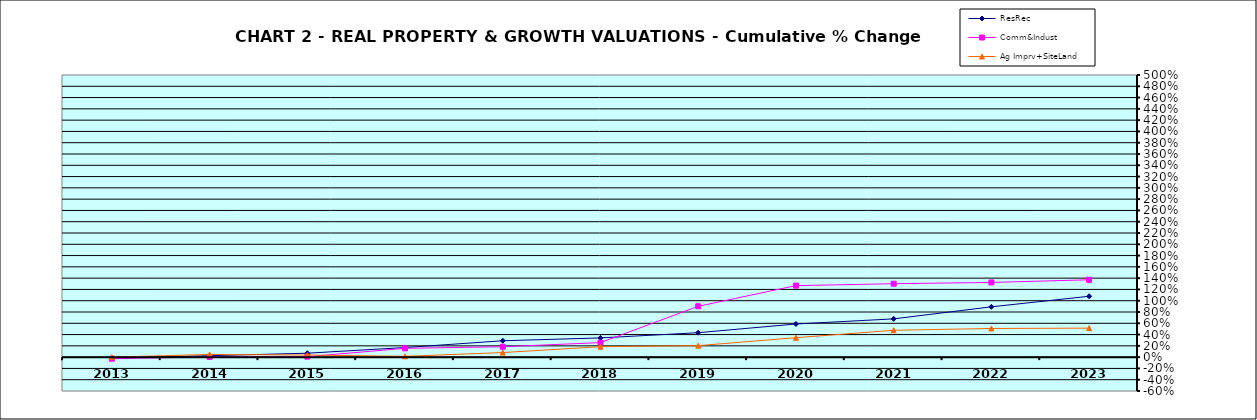
| Category | ResRec | Comm&Indust | Ag Imprv+SiteLand |
|---|---|---|---|
| 2013.0 | -0.018 | -0.027 | 0 |
| 2014.0 | 0.026 | 0.004 | 0.048 |
| 2015.0 | 0.07 | 0.008 | 0.037 |
| 2016.0 | 0.17 | 0.157 | 0.014 |
| 2017.0 | 0.29 | 0.184 | 0.081 |
| 2018.0 | 0.341 | 0.258 | 0.185 |
| 2019.0 | 0.433 | 0.901 | 0.204 |
| 2020.0 | 0.587 | 1.267 | 0.344 |
| 2021.0 | 0.678 | 1.301 | 0.476 |
| 2022.0 | 0.892 | 1.324 | 0.508 |
| 2023.0 | 1.079 | 1.371 | 0.514 |